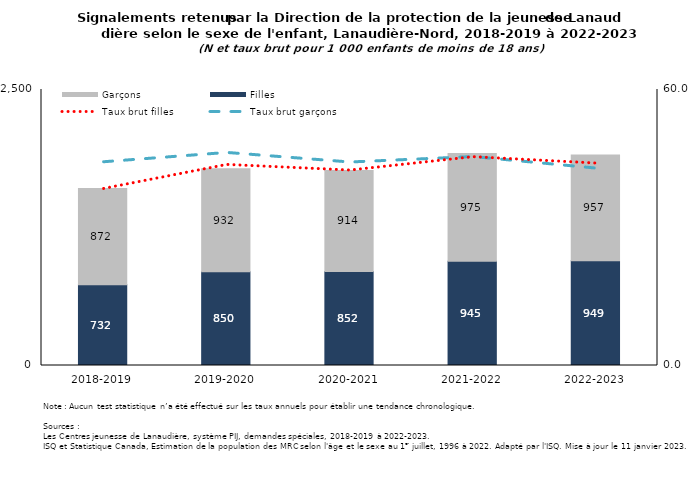
| Category | Filles | Garçons |
|---|---|---|
| 2018-2019 | 732 | 872 |
| 2019-2020 | 850 | 932 |
| 2020-2021 | 852 | 914 |
| 2021-2022 | 945 | 975 |
| 2022-2023 | 949 | 957 |